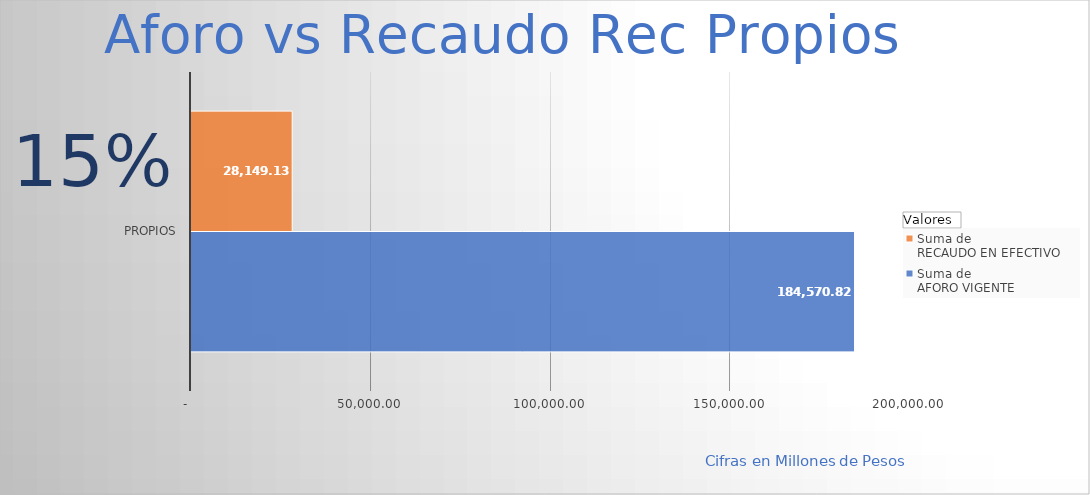
| Category | Suma de 
AFORO VIGENTE
 | Suma de 
RECAUDO EN EFECTIVO 
 |
|---|---|---|
| Propios | 184570.824 | 28149.135 |